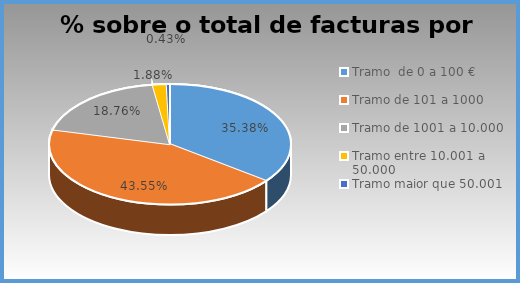
| Category | Series 0 |
|---|---|
| Tramo  de 0 a 100 € | 0.354 |
| Tramo de 101 a 1000 | 0.435 |
| Tramo de 1001 a 10.000 | 0.188 |
| Tramo entre 10.001 a 50.000 | 0.019 |
| Tramo maior que 50.001 | 0.004 |